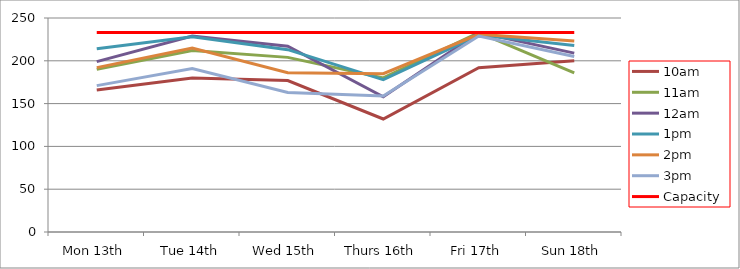
| Category | 9am | 10am | 11am | 12am | 1pm | 2pm | 3pm | 4pm | 5pm | Capacity |
|---|---|---|---|---|---|---|---|---|---|---|
| Mon 13th |  | 166 | 190 | 199 | 214 | 192 | 171 |  |  | 233 |
| Tue 14th |  | 180 | 212 | 229 | 228 | 215 | 191 |  |  | 233 |
| Wed 15th |  | 177 | 204 | 217 | 213 | 186 | 163 |  |  | 233 |
| Thurs 16th |  | 132 | 180 | 158 | 178 | 185 | 159 |  |  | 233 |
| Fri 17th |  | 192 | 233 | 233 | 230 | 231 | 229 |  |  | 233 |
| Sun 18th |  | 200 | 186 | 209 | 218 | 223 | 205 |  |  | 233 |